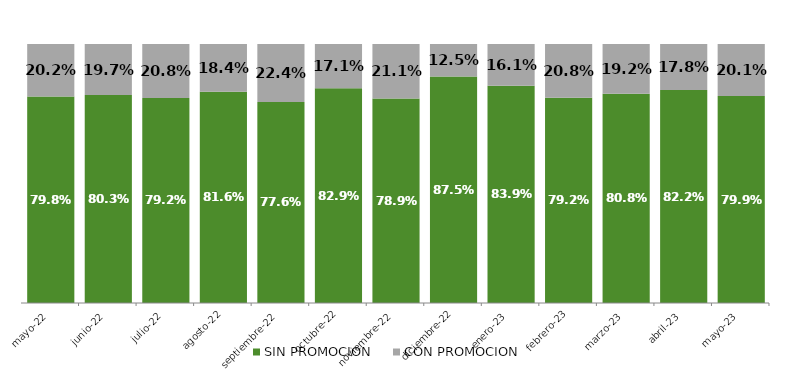
| Category | SIN PROMOCION   | CON PROMOCION   |
|---|---|---|
| 2022-05-01 | 0.798 | 0.202 |
| 2022-06-01 | 0.803 | 0.197 |
| 2022-07-01 | 0.792 | 0.208 |
| 2022-08-01 | 0.816 | 0.184 |
| 2022-09-01 | 0.776 | 0.224 |
| 2022-10-01 | 0.829 | 0.171 |
| 2022-11-01 | 0.789 | 0.211 |
| 2022-12-01 | 0.875 | 0.125 |
| 2023-01-01 | 0.839 | 0.161 |
| 2023-02-01 | 0.792 | 0.208 |
| 2023-03-01 | 0.808 | 0.192 |
| 2023-04-01 | 0.822 | 0.178 |
| 2023-05-01 | 0.799 | 0.201 |